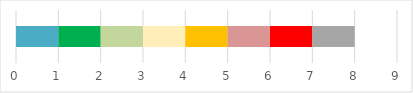
| Category | C | G | LG | LA | A | LR | R | NA |
|---|---|---|---|---|---|---|---|---|
| Customer Readiness | 1 | 1 | 1 | 1 | 1 | 1 | 1 | 1 |